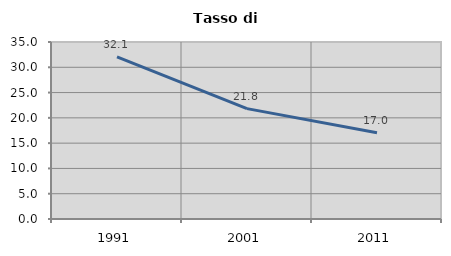
| Category | Tasso di disoccupazione   |
|---|---|
| 1991.0 | 32.064 |
| 2001.0 | 21.828 |
| 2011.0 | 17.047 |